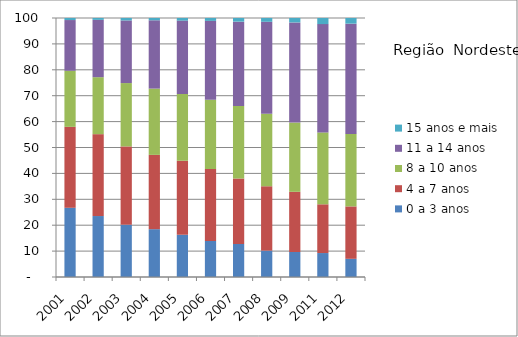
| Category | 0 a 3 anos | 4 a 7 anos | 8 a 10 anos | 11 a 14 anos | 15 anos e mais |
|---|---|---|---|---|---|
| 2001.0 | 26.72 | 31.25 | 21.65 | 19.59 | 0.79 |
| 2002.0 | 23.54 | 31.61 | 22 | 22.13 | 0.73 |
| 2003.0 | 20.19 | 30.23 | 24.46 | 24.18 | 0.95 |
| 2004.0 | 18.47 | 28.68 | 25.59 | 26.38 | 0.88 |
| 2005.0 | 16.3 | 28.58 | 25.77 | 28.34 | 1 |
| 2006.0 | 13.9 | 27.83 | 26.67 | 30.49 | 1.11 |
| 2007.0 | 12.74 | 25.33 | 27.93 | 32.59 | 1.41 |
| 2008.0 | 10.18 | 24.86 | 27.99 | 35.51 | 1.46 |
| 2009.0 | 9.65 | 23.24 | 26.72 | 38.68 | 1.72 |
| 2011.0 | 9.25 | 18.82 | 27.75 | 41.82 | 2.35 |
| 2012.0 | 7.02 | 20.24 | 27.98 | 42.57 | 2.2 |